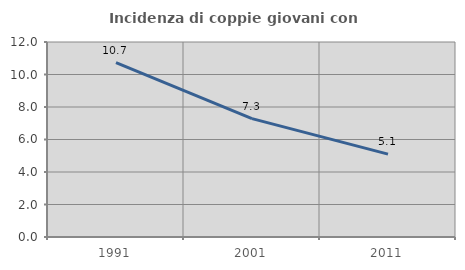
| Category | Incidenza di coppie giovani con figli |
|---|---|
| 1991.0 | 10.726 |
| 2001.0 | 7.287 |
| 2011.0 | 5.102 |